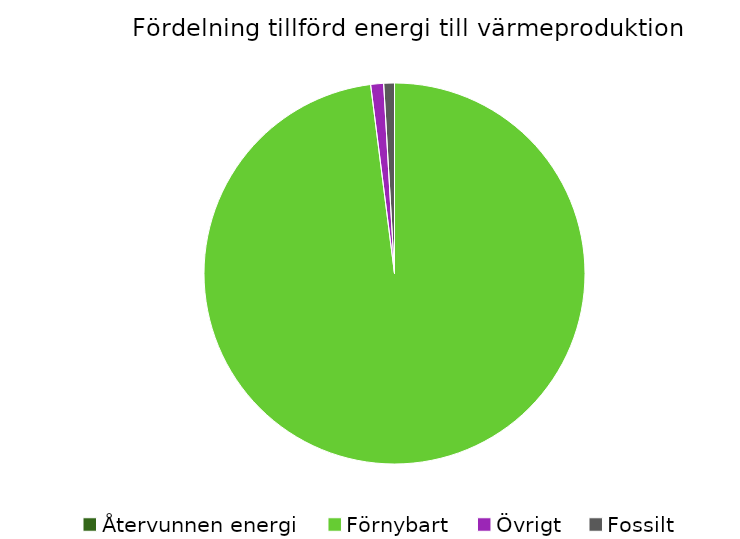
| Category | Fördelning värmeproduktion |
|---|---|
| Återvunnen energi | 0 |
| Förnybart | 0.98 |
| Övrigt | 0.011 |
| Fossilt | 0.009 |